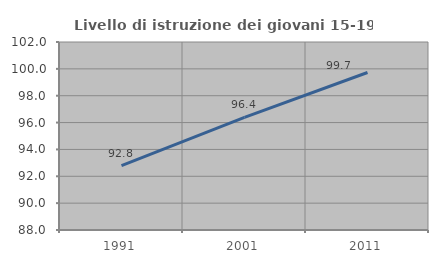
| Category | Livello di istruzione dei giovani 15-19 anni |
|---|---|
| 1991.0 | 92.795 |
| 2001.0 | 96.382 |
| 2011.0 | 99.73 |